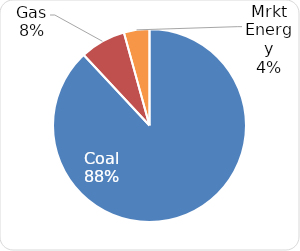
| Category | Series 0 |
|---|---|
| Coal | 5335.866 |
| Gas | 464.79 |
| Mrkt Energy | 259.263 |